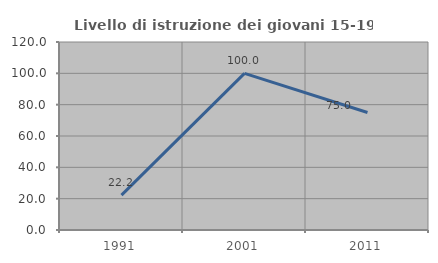
| Category | Livello di istruzione dei giovani 15-19 anni |
|---|---|
| 1991.0 | 22.222 |
| 2001.0 | 100 |
| 2011.0 | 75 |